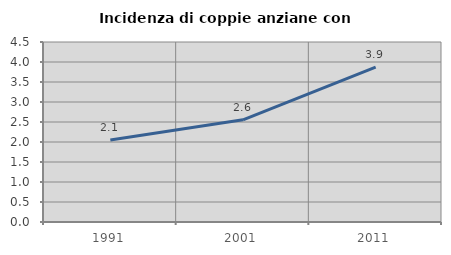
| Category | Incidenza di coppie anziane con figli |
|---|---|
| 1991.0 | 2.051 |
| 2001.0 | 2.554 |
| 2011.0 | 3.873 |